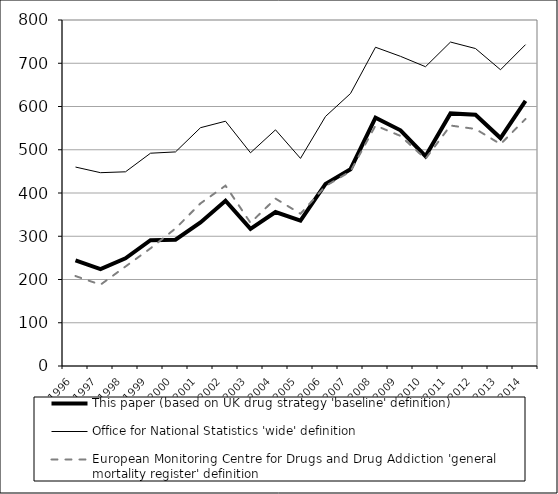
| Category | This paper (based on UK drug strategy 'baseline' definition) | Office for National Statistics 'wide' definition | European Monitoring Centre for Drugs and Drug Addiction 'general mortality register' definition |
|---|---|---|---|
| 1996.0 | 244 | 460 | 208 |
| 1997.0 | 224 | 447 | 188 |
| 1998.0 | 249 | 449 | 230 |
| 1999.0 | 291 | 492 | 272 |
| 2000.0 | 292 | 495 | 318 |
| 2001.0 | 332 | 551 | 376 |
| 2002.0 | 382 | 566 | 417 |
| 2003.0 | 317 | 493 | 331 |
| 2004.0 | 356 | 546 | 387 |
| 2005.0 | 336 | 480 | 352 |
| 2006.0 | 421 | 577 | 416 |
| 2007.0 | 455 | 630 | 450 |
| 2008.0 | 574 | 737 | 556 |
| 2009.0 | 545 | 716 | 532 |
| 2010.0 | 485 | 692 | 479 |
| 2011.0 | 584 | 749 | 556 |
| 2012.0 | 581 | 734 | 548 |
| 2013.0 | 527 | 685 | 513 |
| 2014.0 | 613 | 743 | 571 |